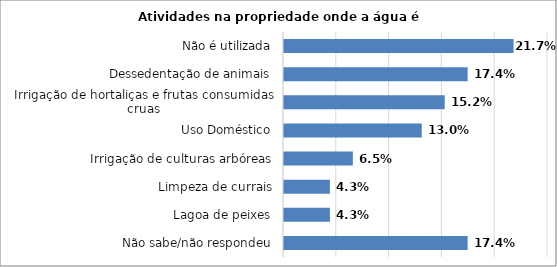
| Category | Series 0 |
|---|---|
| Não sabe/não respondeu | 0.174 |
| Lagoa de peixes | 0.043 |
| Limpeza de currais | 0.043 |
| Irrigação de culturas arbóreas | 0.065 |
| Uso Doméstico | 0.13 |
| Irrigação de hortaliças e frutas consumidas cruas | 0.152 |
| Dessedentação de animais | 0.174 |
| Não é utilizada | 0.217 |